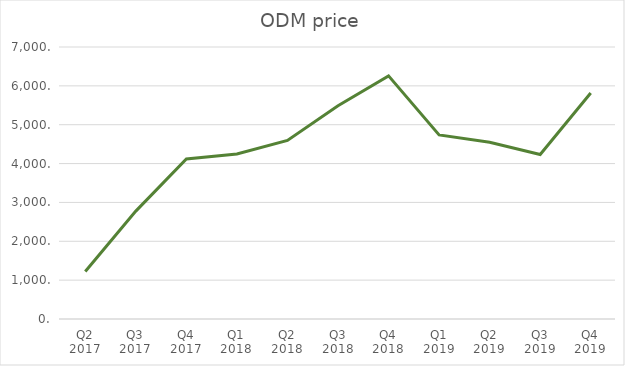
| Category | Series 0 |
|---|---|
| Q2 2017 | 1224.5 |
| Q3 2017 | 2776.2 |
| Q4 2017 | 4118.7 |
| Q1 2018 | 4245.4 |
| Q2 2018 | 4594.5 |
| Q3 2018 | 5488.2 |
| Q4 2018 | 6257.2 |
| Q1 2019 | 4736.2 |
| Q2 2019 | 4549.3 |
| Q3 2019 | 4232.7 |
| Q4 2019 | 5816 |